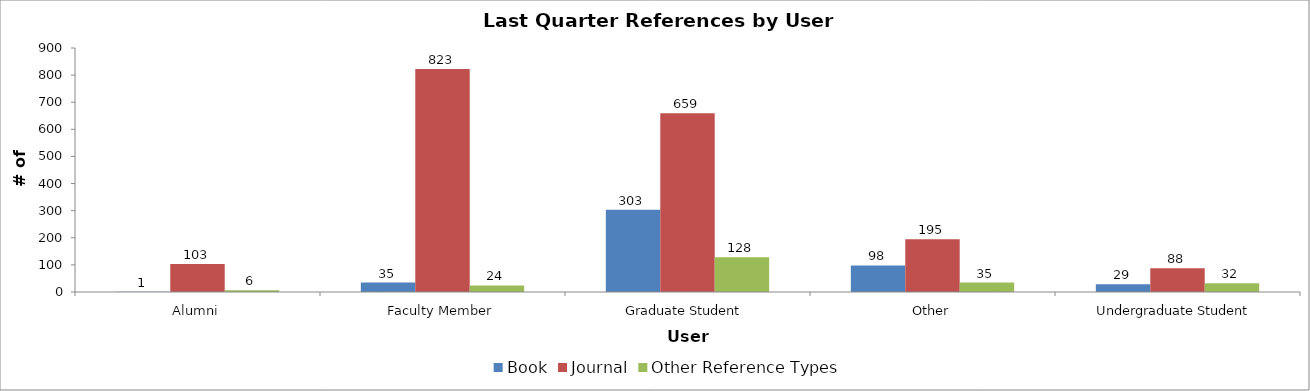
| Category | Book | Journal | Other Reference Types |
|---|---|---|---|
| Alumni | 1 | 103 | 6 |
| Faculty Member | 35 | 823 | 24 |
| Graduate Student | 303 | 659 | 128 |
| Other | 98 | 195 | 35 |
| Undergraduate Student | 29 | 88 | 32 |